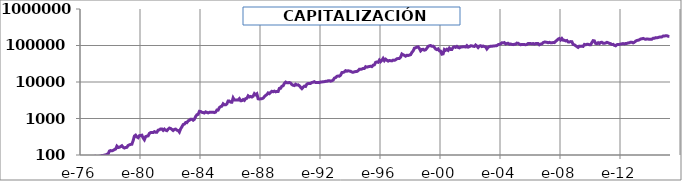
| Category | CAPITALIZACIÓN BERKSHIRE |
|---|---|
| 1976-10-14 | 65.53 |
| 1976-11-14 | 64.55 |
| 1976-12-14 | 78.24 |
| 1977-01-14 | 91.93 |
| 1977-02-14 | 89.98 |
| 1977-03-14 | 86.06 |
| 1977-04-14 | 92.43 |
| 1977-05-14 | 92.43 |
| 1977-06-14 | 97.3 |
| 1977-07-14 | 97.3 |
| 1977-08-14 | 99.25 |
| 1977-09-14 | 100.01 |
| 1977-10-14 | 104.87 |
| 1977-11-14 | 106.81 |
| 1977-12-14 | 128.17 |
| 1978-01-14 | 132.06 |
| 1978-02-14 | 130.11 |
| 1978-03-14 | 134 |
| 1978-04-14 | 140.79 |
| 1978-05-14 | 145.65 |
| 1978-06-14 | 174.78 |
| 1978-07-14 | 160.21 |
| 1978-08-14 | 163.13 |
| 1978-09-14 | 169.92 |
| 1978-10-14 | 179.63 |
| 1978-11-14 | 163.13 |
| 1978-12-14 | 155.36 |
| 1979-01-14 | 160.21 |
| 1979-02-14 | 162.27 |
| 1979-03-14 | 182.81 |
| 1979-04-14 | 189.99 |
| 1979-05-14 | 195.13 |
| 1979-06-14 | 197.18 |
| 1979-07-14 | 246.48 |
| 1979-08-14 | 328.64 |
| 1979-09-14 | 349.18 |
| 1979-10-14 | 313.23 |
| 1979-11-14 | 297.83 |
| 1979-12-14 | 338.91 |
| 1980-01-14 | 344.04 |
| 1980-02-14 | 349.18 |
| 1980-03-14 | 292.69 |
| 1980-04-14 | 261.88 |
| 1980-05-14 | 318.37 |
| 1980-06-14 | 328.64 |
| 1980-07-14 | 333.77 |
| 1980-08-14 | 390.26 |
| 1980-09-14 | 410.8 |
| 1980-10-14 | 410.8 |
| 1980-11-14 | 410.8 |
| 1980-12-14 | 436.47 |
| 1981-01-14 | 419.05 |
| 1981-02-14 | 419.05 |
| 1981-03-14 | 478.21 |
| 1981-04-14 | 488.07 |
| 1981-05-14 | 517.65 |
| 1981-06-14 | 517.65 |
| 1981-07-14 | 473.28 |
| 1981-08-14 | 512.72 |
| 1981-09-14 | 478.69 |
| 1981-10-14 | 463.89 |
| 1981-11-14 | 508.3 |
| 1981-12-14 | 547.78 |
| 1982-01-14 | 532.98 |
| 1982-02-14 | 503.37 |
| 1982-03-14 | 468.82 |
| 1982-04-14 | 503.37 |
| 1982-05-14 | 513.24 |
| 1982-06-14 | 478.69 |
| 1982-07-14 | 468.82 |
| 1982-08-14 | 424.41 |
| 1982-09-14 | 518.17 |
| 1982-10-14 | 592.2 |
| 1982-11-14 | 681.03 |
| 1982-12-14 | 700.77 |
| 1983-01-14 | 774.79 |
| 1983-02-14 | 769.86 |
| 1983-03-14 | 858.69 |
| 1983-04-14 | 893.23 |
| 1983-05-14 | 957.39 |
| 1983-06-14 | 957.39 |
| 1983-07-14 | 898.17 |
| 1983-08-14 | 952.45 |
| 1983-09-14 | 1130.11 |
| 1983-10-14 | 1268.29 |
| 1983-11-14 | 1292.97 |
| 1983-12-14 | 1571.39 |
| 1984-01-14 | 1559.92 |
| 1984-02-14 | 1473.89 |
| 1984-03-14 | 1456.69 |
| 1984-04-14 | 1416.54 |
| 1984-05-14 | 1519.77 |
| 1984-06-14 | 1473.89 |
| 1984-07-14 | 1422.28 |
| 1984-08-14 | 1473.89 |
| 1984-09-14 | 1485.36 |
| 1984-10-14 | 1491.1 |
| 1984-11-14 | 1491.1 |
| 1984-12-14 | 1450.95 |
| 1985-01-14 | 1496.83 |
| 1985-02-14 | 1703.29 |
| 1985-03-14 | 1697.56 |
| 1985-04-14 | 1984.31 |
| 1985-05-14 | 2116.21 |
| 1985-06-14 | 2179.3 |
| 1985-07-14 | 2529.13 |
| 1985-08-14 | 2374.29 |
| 1985-09-14 | 2368.55 |
| 1985-10-14 | 2511.93 |
| 1985-11-14 | 3016.61 |
| 1985-12-14 | 3005.14 |
| 1986-01-14 | 2810.15 |
| 1986-02-14 | 2792.94 |
| 1986-03-14 | 3670.4 |
| 1986-04-14 | 3211.6 |
| 1986-05-14 | 3188.66 |
| 1986-06-14 | 3234.54 |
| 1986-07-14 | 3211.6 |
| 1986-08-14 | 3498.35 |
| 1986-09-14 | 3068.22 |
| 1986-10-14 | 3085.43 |
| 1986-11-14 | 3303.36 |
| 1986-12-14 | 3131.31 |
| 1987-01-14 | 3498.35 |
| 1987-02-14 | 3584.37 |
| 1987-03-14 | 4163.61 |
| 1987-04-14 | 3888.33 |
| 1987-05-14 | 4025.97 |
| 1987-06-14 | 3876.86 |
| 1987-07-14 | 4071.85 |
| 1987-08-14 | 4794.46 |
| 1987-09-14 | 4461.83 |
| 1987-10-14 | 4748.58 |
| 1987-11-14 | 3469.67 |
| 1987-12-14 | 3412.32 |
| 1988-01-14 | 3475.41 |
| 1988-02-14 | 3498.35 |
| 1988-03-14 | 3613.05 |
| 1988-04-14 | 3957.15 |
| 1988-05-14 | 4272.57 |
| 1988-06-14 | 4530.65 |
| 1988-07-14 | 5018.12 |
| 1988-08-14 | 4817.39 |
| 1988-09-14 | 5218.85 |
| 1988-10-14 | 5562.95 |
| 1988-11-14 | 5390.9 |
| 1988-12-14 | 5620.3 |
| 1989-01-14 | 5386.2 |
| 1989-02-14 | 5529.45 |
| 1989-03-14 | 5483.61 |
| 1989-04-14 | 6704.1 |
| 1989-05-14 | 6761.39 |
| 1989-06-14 | 7649.55 |
| 1989-07-14 | 7878.75 |
| 1989-08-14 | 9173.73 |
| 1989-09-14 | 9970.2 |
| 1989-10-14 | 9511.8 |
| 1989-11-14 | 9517.53 |
| 1989-12-14 | 9712.35 |
| 1990-01-14 | 9368.55 |
| 1990-02-14 | 8509.05 |
| 1990-03-14 | 8159.52 |
| 1990-04-14 | 7993.35 |
| 1990-05-14 | 8680.95 |
| 1990-06-14 | 8279.85 |
| 1990-07-14 | 8365.8 |
| 1990-08-14 | 7907.4 |
| 1990-09-14 | 7133.85 |
| 1990-10-14 | 6572.3 |
| 1990-11-14 | 7191.14 |
| 1990-12-14 | 7735.5 |
| 1991-01-14 | 7575.05 |
| 1991-02-14 | 8738.25 |
| 1991-03-14 | 9139.35 |
| 1991-04-14 | 9168 |
| 1991-05-14 | 9168 |
| 1991-06-14 | 9712.35 |
| 1991-07-14 | 9855.6 |
| 1991-08-14 | 10199.39 |
| 1991-09-14 | 9683.7 |
| 1991-10-14 | 9683.7 |
| 1991-11-14 | 9769.65 |
| 1991-12-14 | 9597.75 |
| 1992-01-14 | 10027.5 |
| 1992-02-14 | 10027.5 |
| 1992-03-14 | 10142.1 |
| 1992-04-14 | 10228.05 |
| 1992-05-14 | 10428.6 |
| 1992-06-14 | 10440.06 |
| 1992-07-14 | 10801.05 |
| 1992-08-14 | 10887 |
| 1992-09-14 | 10543.2 |
| 1992-10-14 | 10778.13 |
| 1992-11-14 | 11230.8 |
| 1992-12-14 | 12777.9 |
| 1993-01-14 | 13190.4 |
| 1993-02-14 | 14284.8 |
| 1993-03-14 | 14630.4 |
| 1993-04-14 | 14378.7 |
| 1993-05-14 | 15498 |
| 1993-06-14 | 18130.92 |
| 1993-07-14 | 18332.7 |
| 1993-08-14 | 18851.55 |
| 1993-09-14 | 20419.63 |
| 1993-10-14 | 19745.12 |
| 1993-11-14 | 20350.45 |
| 1993-12-14 | 19908.2 |
| 1994-01-14 | 19672.6 |
| 1994-02-14 | 18730.2 |
| 1994-03-14 | 18435.7 |
| 1994-04-14 | 19024.7 |
| 1994-05-14 | 19319.2 |
| 1994-06-14 | 19437 |
| 1994-07-14 | 20379.4 |
| 1994-08-14 | 22382 |
| 1994-09-14 | 22264.2 |
| 1994-10-14 | 22617.6 |
| 1994-11-14 | 23560 |
| 1994-12-14 | 23560 |
| 1995-01-14 | 26269.4 |
| 1995-02-14 | 25444.8 |
| 1995-03-14 | 26151.6 |
| 1995-04-14 | 26622.8 |
| 1995-05-14 | 27035.09 |
| 1995-06-14 | 26329.2 |
| 1995-07-14 | 28879.1 |
| 1995-08-14 | 29531.4 |
| 1995-09-14 | 34626 |
| 1995-10-14 | 35402.1 |
| 1995-11-14 | 34626 |
| 1995-12-14 | 39760.2 |
| 1996-01-14 | 36058.8 |
| 1996-02-14 | 39402 |
| 1996-03-14 | 44297.38 |
| 1996-04-14 | 38446.8 |
| 1996-05-14 | 42148.2 |
| 1996-06-14 | 39521.39 |
| 1996-07-14 | 37342.35 |
| 1996-08-14 | 38805 |
| 1996-09-14 | 38387.09 |
| 1996-10-14 | 37929.1 |
| 1996-11-14 | 39712.6 |
| 1996-12-14 | 39237 |
| 1997-01-14 | 40782.7 |
| 1997-02-14 | 43279.56 |
| 1997-03-14 | 43874.1 |
| 1997-04-14 | 44111.87 |
| 1997-05-14 | 48079.46 |
| 1997-06-14 | 58514.39 |
| 1997-07-14 | 55865.59 |
| 1997-08-14 | 53818.78 |
| 1997-09-14 | 50999.99 |
| 1997-10-14 | 53999.98 |
| 1997-11-14 | 53279.99 |
| 1997-12-14 | 54748.57 |
| 1998-01-14 | 56186.18 |
| 1998-02-14 | 64572.17 |
| 1998-03-14 | 71041.38 |
| 1998-04-14 | 84458.94 |
| 1998-05-14 | 86375.75 |
| 1998-06-14 | 90667.94 |
| 1998-07-14 | 91860.94 |
| 1998-08-14 | 82536.56 |
| 1998-09-14 | 71276.75 |
| 1998-10-14 | 77670.38 |
| 1998-11-14 | 78617.56 |
| 1998-12-14 | 74355.13 |
| 1999-01-14 | 76486.31 |
| 1999-02-14 | 84182.38 |
| 1999-03-14 | 95075.13 |
| 1999-04-14 | 98038.94 |
| 1999-05-14 | 99784.81 |
| 1999-06-14 | 95084.38 |
| 1999-07-14 | 95890.13 |
| 1999-08-14 | 88772.25 |
| 1999-09-14 | 80251.56 |
| 1999-10-14 | 77164.94 |
| 1999-11-14 | 80922.56 |
| 1999-12-14 | 71662.75 |
| 2000-01-14 | 70052.31 |
| 2000-02-14 | 57840.19 |
| 2000-03-14 | 59047.98 |
| 2000-04-14 | 77777.94 |
| 2000-05-14 | 73754.94 |
| 2000-06-14 | 78716.63 |
| 2000-07-14 | 73620.88 |
| 2000-08-14 | 84751.19 |
| 2000-09-14 | 78086.38 |
| 2000-10-14 | 77952 |
| 2000-11-14 | 88972.75 |
| 2000-12-14 | 92198.38 |
| 2001-01-14 | 88972.75 |
| 2001-02-14 | 94483.13 |
| 2001-03-14 | 88569.56 |
| 2001-04-14 | 86086.25 |
| 2001-05-14 | 90249.56 |
| 2001-06-14 | 90853.38 |
| 2001-07-14 | 92732.13 |
| 2001-08-14 | 92248.44 |
| 2001-09-14 | 90779.94 |
| 2001-10-14 | 98656.44 |
| 2001-11-14 | 90167.94 |
| 2001-12-14 | 92753.63 |
| 2002-01-14 | 97991.38 |
| 2002-02-14 | 97593.56 |
| 2002-03-14 | 95471.94 |
| 2002-04-14 | 93932.94 |
| 2002-05-14 | 103037.9 |
| 2002-06-14 | 96432.94 |
| 2002-07-14 | 87978.56 |
| 2002-08-14 | 96667.75 |
| 2002-09-14 | 98774.94 |
| 2002-10-14 | 93388.38 |
| 2002-11-14 | 96710.31 |
| 2002-12-14 | 93556.75 |
| 2003-01-14 | 91585.75 |
| 2003-02-14 | 80416.75 |
| 2003-03-14 | 89142.88 |
| 2003-04-14 | 92925.81 |
| 2003-05-14 | 95900.75 |
| 2003-06-14 | 95509.81 |
| 2003-07-14 | 96421.94 |
| 2003-08-14 | 97438.19 |
| 2003-09-14 | 98085.19 |
| 2003-10-14 | 99120.31 |
| 2003-11-14 | 105345.5 |
| 2003-12-14 | 107676.8 |
| 2004-01-14 | 110774.4 |
| 2004-02-14 | 118367.2 |
| 2004-03-14 | 117767.6 |
| 2004-04-14 | 120387.6 |
| 2004-05-14 | 110287.4 |
| 2004-06-14 | 113602.5 |
| 2004-07-14 | 115259.9 |
| 2004-08-14 | 108247.1 |
| 2004-09-14 | 109773.6 |
| 2004-10-14 | 107356.8 |
| 2004-11-14 | 105790.9 |
| 2004-12-14 | 108076.9 |
| 2005-01-14 | 109029.4 |
| 2005-02-14 | 116179.6 |
| 2005-03-14 | 114790.2 |
| 2005-04-14 | 108961.9 |
| 2005-05-14 | 105077.9 |
| 2005-06-14 | 106850.4 |
| 2005-07-14 | 105964.1 |
| 2005-08-14 | 106344.6 |
| 2005-09-14 | 104955.3 |
| 2005-10-14 | 106849.8 |
| 2005-11-14 | 113666.5 |
| 2005-12-14 | 112481.2 |
| 2006-01-14 | 112985.6 |
| 2006-02-14 | 111094.1 |
| 2006-03-14 | 113174.7 |
| 2006-04-14 | 109328.6 |
| 2006-05-14 | 112684.2 |
| 2006-06-14 | 113435.9 |
| 2006-07-14 | 113058.1 |
| 2006-08-14 | 104576.5 |
| 2006-09-14 | 109332.3 |
| 2006-10-14 | 111250.4 |
| 2006-11-14 | 119784.3 |
| 2006-12-14 | 123862.4 |
| 2007-01-14 | 123749.9 |
| 2007-02-14 | 122062.4 |
| 2007-03-14 | 118975.1 |
| 2007-04-14 | 122428.6 |
| 2007-05-14 | 118863.4 |
| 2007-06-14 | 118809.1 |
| 2007-07-14 | 120341.7 |
| 2007-08-14 | 119953.3 |
| 2007-09-14 | 130679.9 |
| 2007-10-14 | 138411.8 |
| 2007-11-14 | 149324.9 |
| 2007-12-14 | 155297.9 |
| 2008-01-14 | 141625.2 |
| 2008-02-14 | 155287.1 |
| 2008-03-14 | 139838.1 |
| 2008-04-14 | 138924.6 |
| 2008-05-14 | 133379.9 |
| 2008-06-14 | 137159.9 |
| 2008-07-14 | 125279.9 |
| 2008-08-14 | 124450.1 |
| 2008-09-14 | 127984.4 |
| 2008-10-14 | 127288.3 |
| 2008-11-14 | 107160.9 |
| 2008-12-14 | 104391.8 |
| 2009-01-14 | 98832.13 |
| 2009-02-14 | 93516.5 |
| 2009-03-14 | 88395.88 |
| 2009-04-14 | 95960.56 |
| 2009-05-14 | 94707.13 |
| 2009-06-14 | 96049.5 |
| 2009-07-14 | 94495.75 |
| 2009-08-14 | 107179.8 |
| 2009-09-14 | 104378.7 |
| 2009-10-14 | 107813.9 |
| 2009-11-14 | 107860.3 |
| 2009-12-14 | 104966.4 |
| 2010-01-14 | 104543.9 |
| 2010-02-14 | 120383.9 |
| 2010-03-14 | 135983.6 |
| 2010-04-14 | 133665.8 |
| 2010-05-14 | 114299.8 |
| 2010-06-14 | 112347.3 |
| 2010-07-14 | 119176.3 |
| 2010-08-14 | 112463.3 |
| 2010-09-14 | 121573.3 |
| 2010-10-14 | 122649.3 |
| 2010-11-14 | 115073.9 |
| 2010-12-14 | 114929.5 |
| 2011-01-14 | 117104.8 |
| 2011-02-14 | 122244.1 |
| 2011-03-14 | 119139.4 |
| 2011-04-14 | 114282.4 |
| 2011-05-14 | 112500.3 |
| 2011-06-14 | 106106.7 |
| 2011-07-14 | 107422.9 |
| 2011-08-14 | 101141.9 |
| 2011-09-14 | 98133.94 |
| 2011-10-14 | 105465.8 |
| 2011-11-14 | 107003.7 |
| 2011-12-14 | 106326.4 |
| 2012-01-14 | 109444.8 |
| 2012-02-14 | 111281.2 |
| 2012-03-14 | 113102.1 |
| 2012-04-14 | 110590.2 |
| 2012-05-14 | 113279.1 |
| 2012-06-14 | 114140.3 |
| 2012-07-14 | 117887.5 |
| 2012-08-14 | 118184.5 |
| 2012-09-14 | 123403.7 |
| 2012-10-14 | 122941.6 |
| 2012-11-14 | 117807.9 |
| 2012-12-14 | 122997.4 |
| 2013-01-14 | 131459.5 |
| 2013-02-14 | 137195.9 |
| 2013-03-14 | 139245.5 |
| 2013-04-14 | 143293.7 |
| 2013-05-14 | 150849.4 |
| 2013-06-14 | 152624.7 |
| 2013-07-14 | 156408.7 |
| 2013-08-14 | 151765.5 |
| 2013-09-14 | 147770.6 |
| 2013-10-14 | 151283.5 |
| 2013-11-14 | 149739.5 |
| 2013-12-14 | 147821.6 |
| 2014-01-14 | 148815.1 |
| 2014-02-14 | 148966.3 |
| 2014-03-14 | 157723.8 |
| 2014-04-14 | 157167.9 |
| 2014-05-14 | 163942.1 |
| 2014-06-14 | 162314.8 |
| 2014-07-14 | 165620.8 |
| 2014-08-14 | 169502.8 |
| 2014-09-14 | 171829.9 |
| 2014-10-14 | 172155.9 |
| 2014-11-14 | 181441.7 |
| 2014-12-14 | 182254.8 |
| 2015-01-14 | 184649.9 |
| 2015-02-14 | 185213.3 |
| 2015-03-14 | 179104.9 |
| 2015-04-14 | 176879.3 |